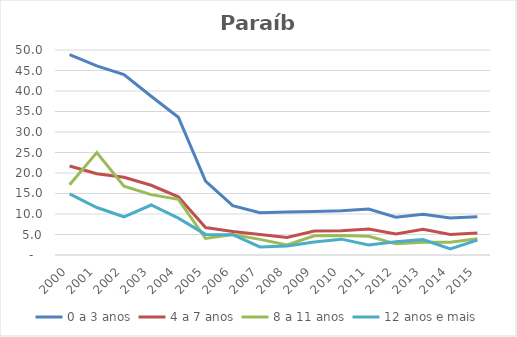
| Category | 0 a 3 anos | 4 a 7 anos | 8 a 11 anos | 12 anos e mais |
|---|---|---|---|---|
| 2000.0 | 48.857 | 21.722 | 17.155 | 14.894 |
| 2001.0 | 46.135 | 19.836 | 25 | 11.585 |
| 2002.0 | 43.997 | 18.952 | 16.794 | 9.322 |
| 2003.0 | 38.723 | 17.005 | 14.731 | 12.195 |
| 2004.0 | 33.61 | 14.19 | 13.571 | 8.997 |
| 2005.0 | 18.013 | 6.711 | 4.024 | 5.028 |
| 2006.0 | 12.048 | 5.712 | 5 | 4.946 |
| 2007.0 | 10.319 | 5.007 | 3.814 | 1.978 |
| 2008.0 | 10.487 | 4.267 | 2.458 | 2.203 |
| 2009.0 | 10.615 | 5.873 | 4.673 | 3.172 |
| 2010.0 | 10.806 | 5.925 | 4.751 | 3.867 |
| 2011.0 | 11.231 | 6.346 | 4.569 | 2.467 |
| 2012.0 | 9.196 | 5.157 | 2.717 | 3.231 |
| 2013.0 | 9.966 | 6.253 | 3.081 | 3.745 |
| 2014.0 | 9.044 | 5.007 | 3.098 | 1.468 |
| 2015.0 | 9.348 | 5.354 | 3.987 | 3.642 |